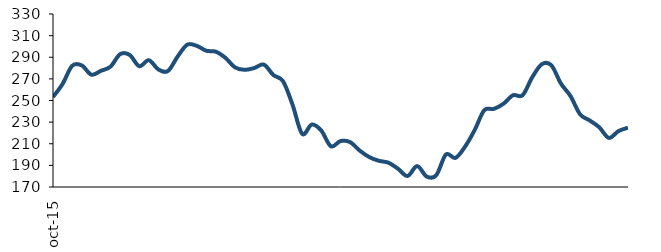
| Category | Series 0 |
|---|---|
| 2015-10-01 | 253.244 |
| 2015-11-01 | 265.312 |
| 2015-12-01 | 282.064 |
| 2016-01-01 | 282.467 |
| 2016-02-01 | 273.883 |
| 2016-03-01 | 277.46 |
| 2016-04-01 | 281.303 |
| 2016-05-01 | 292.814 |
| 2016-06-01 | 292.143 |
| 2016-07-01 | 281.724 |
| 2016-08-01 | 287.27 |
| 2016-09-01 | 278.677 |
| 2016-10-01 | 277.33 |
| 2016-11-01 | 290.584 |
| 2016-12-01 | 301.598 |
| 2017-01-01 | 300.554 |
| 2017-02-01 | 296 |
| 2017-03-01 | 295.118 |
| 2017-04-01 | 289.361 |
| 2017-05-01 | 280.622 |
| 2017-06-01 | 278.382 |
| 2017-07-01 | 280.028 |
| 2017-08-01 | 283.236 |
| 2017-09-01 | 273.531 |
| 2017-10-01 | 267.828 |
| 2017-11-01 | 245.988 |
| 2017-12-01 | 219.128 |
| 2018-01-01 | 227.748 |
| 2018-02-01 | 222.13 |
| 2018-03-01 | 207.624 |
| 2018-04-01 | 212.488 |
| 2018-05-01 | 211.512 |
| 2018-06-01 | 203.714 |
| 2018-07-01 | 197.679 |
| 2018-08-01 | 194.248 |
| 2018-09-01 | 192.47 |
| 2018-10-01 | 186.857 |
| 2018-11-01 | 180.178 |
| 2018-12-01 | 189.347 |
| 2019-01-01 | 179.613 |
| 2019-02-01 | 181.017 |
| 2019-03-01 | 200.069 |
| 2019-04-01 | 196.908 |
| 2019-05-01 | 207.378 |
| 2019-06-01 | 222.649 |
| 2019-07-01 | 241.003 |
| 2019-08-01 | 242.252 |
| 2019-09-01 | 246.969 |
| 2019-10-01 | 254.848 |
| 2019-11-01 | 254.863 |
| 2019-12-01 | 271.361 |
| 2020-01-01 | 283.496 |
| 2020-02-01 | 282.571 |
| 2020-03-01 | 265.686 |
| 2020-04-01 | 254.092 |
| 2020-05-01 | 237.244 |
| 2020-06-01 | 231.555 |
| 2020-07-01 | 225.236 |
| 2020-08-01 | 215.435 |
| 2020-09-01 | 221.664 |
| 2020-10-01 | 224.87 |